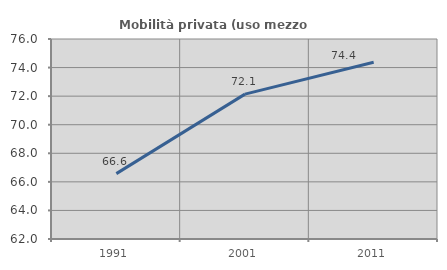
| Category | Mobilità privata (uso mezzo privato) |
|---|---|
| 1991.0 | 66.576 |
| 2001.0 | 72.143 |
| 2011.0 | 74.376 |